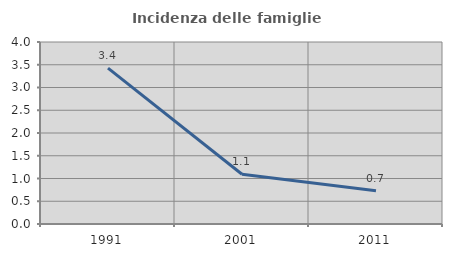
| Category | Incidenza delle famiglie numerose |
|---|---|
| 1991.0 | 3.427 |
| 2001.0 | 1.093 |
| 2011.0 | 0.73 |